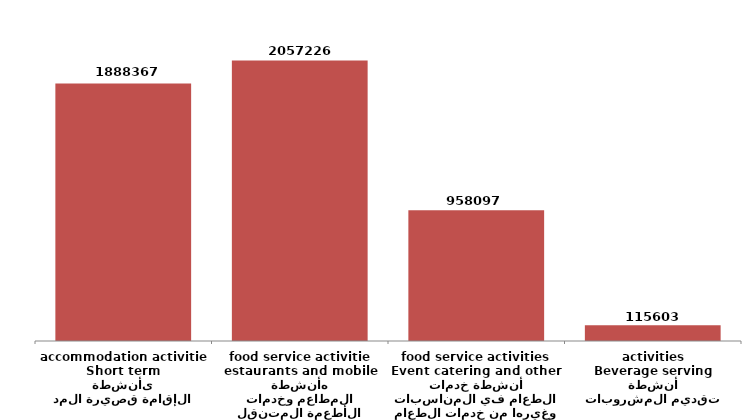
| Category | Series 0 |
|---|---|
| أنشطة الإقامة قصيرة المدى
Short term accommodation activities | 1888367 |
| أنشطة المطاعم وخدمات الأطعمة المتنقله
estaurants and mobile food service activities | 2057226 |
| أنشطة خدمات الطعام في المناسبات وغيرها من خدمات الطعام
Event catering and other food service activities | 958097 |
| أنشطة تقديم المشروبات
Beverage serving activities | 115603 |